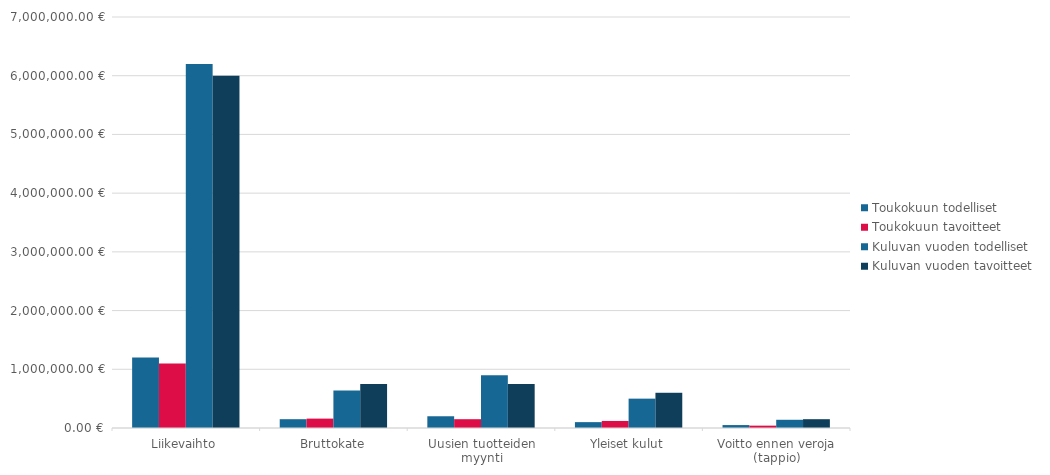
| Category | Toukokuun todelliset | Toukokuun tavoitteet | Kuluvan vuoden todelliset | Kuluvan vuoden tavoitteet |
|---|---|---|---|---|
| Liikevaihto | 1200000 | 1100000 | 6200000 | 6000000 |
| Bruttokate | 150000 | 160000 | 640000 | 750000 |
| Uusien tuotteiden myynti | 200000 | 150000 | 900000 | 750000 |
| Yleiset kulut | 100000 | 120000 | 500000 | 600000 |
| Voitto ennen veroja (tappio) | 50000 | 40000 | 140000 | 150000 |